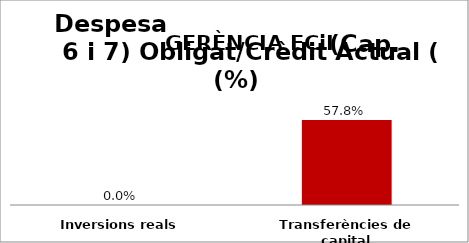
| Category | Series 0 |
|---|---|
| Inversions reals | 0 |
| Transferències de capital | 0.578 |